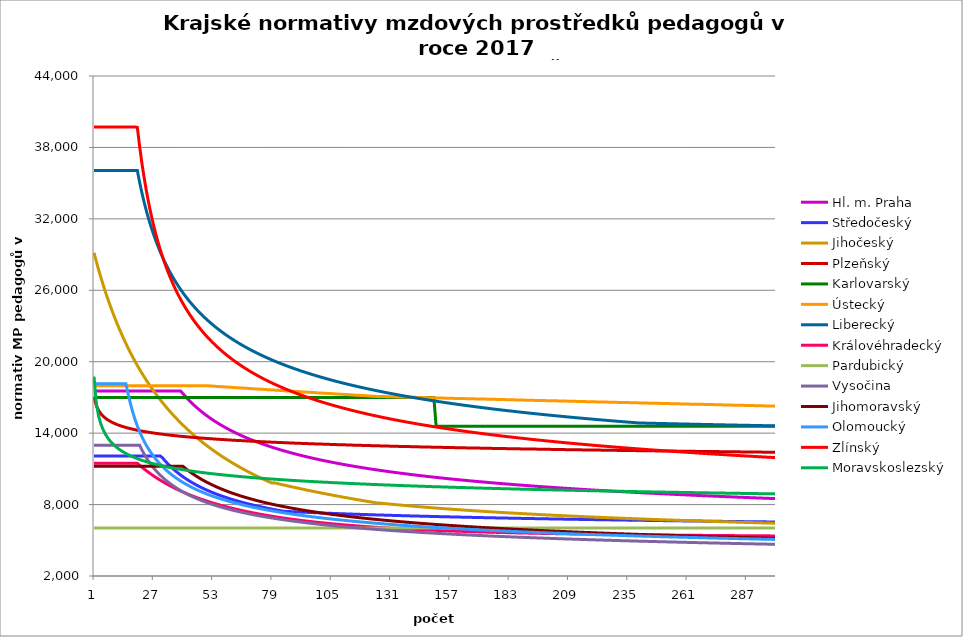
| Category | Hl. m. Praha | Středočeský | Jihočeský | Plzeňský | Karlovarský  | Ústecký   | Liberecký | Královéhradecký | Pardubický | Vysočina | Jihomoravský | Olomoucký | Zlínský | Moravskoslezský |
|---|---|---|---|---|---|---|---|---|---|---|---|---|---|---|
| 0 | 17540.399 | 12085.225 | 29144.953 | 17065.183 | 17000 | 17988.82 | 36063.29 | 11471.338 | 6030.48 | 12987.917 | 11210.627 | 18145.624 | 39713.089 | 18748.669 |
| 1 | 17540.399 | 12085.225 | 28426.203 | 16321.338 | 17000 | 17988.82 | 36063.29 | 11471.338 | 6030.48 | 12987.917 | 11210.627 | 18145.624 | 39713.089 | 16521.105 |
| 2 | 17540.399 | 12085.225 | 27742.05 | 15910.079 | 17000 | 17988.82 | 36063.29 | 11471.338 | 6030.48 | 12987.917 | 11210.627 | 18145.624 | 39713.089 | 15450.292 |
| 3 | 17540.399 | 12085.225 | 27090.055 | 15632.039 | 17000 | 17988.82 | 36063.29 | 11471.338 | 6030.48 | 12987.917 | 11210.627 | 18145.624 | 39713.089 | 14773.532 |
| 4 | 17540.399 | 12085.225 | 26468.003 | 15422.414 | 17000 | 17988.82 | 36063.29 | 11471.338 | 6030.48 | 12987.917 | 11210.627 | 18145.624 | 39713.089 | 14287.517 |
| 5 | 17540.399 | 12085.225 | 25873.877 | 15261.611 | 17000 | 17988.82 | 36063.29 | 11471.338 | 6030.48 | 12987.917 | 11210.627 | 18145.624 | 39713.089 | 13911.365 |
| 6 | 17540.399 | 12085.225 | 25305.838 | 15118.31 | 17000 | 17988.82 | 36063.29 | 11471.338 | 6030.48 | 12987.917 | 11210.627 | 18145.624 | 39713.089 | 13606.867 |
| 7 | 17540.399 | 12085.225 | 24762.205 | 15005.592 | 17000 | 17988.82 | 36063.29 | 11471.338 | 6030.48 | 12987.917 | 11210.627 | 18145.624 | 39713.089 | 13354.676 |
| 8 | 17540.399 | 12085.225 | 24241.438 | 14901.435 | 17000 | 17988.82 | 36063.29 | 11471.338 | 6030.48 | 12987.917 | 11210.627 | 18145.624 | 39713.089 | 13144.279 |
| 9 | 17540.399 | 12085.225 | 23742.124 | 14812.328 | 17000 | 17988.82 | 36063.29 | 11471.338 | 6030.48 | 12987.917 | 11210.627 | 18145.624 | 39713.089 | 12956.273 |
| 10 | 17540.399 | 12085.225 | 23262.964 | 14731.016 | 17000 | 17988.82 | 36063.29 | 11471.338 | 6030.48 | 12987.917 | 11210.627 | 18145.624 | 39713.089 | 12794.189 |
| 11 | 17540.399 | 12085.225 | 22802.763 | 14657.26 | 17000 | 17988.82 | 36063.29 | 11471.338 | 6030.48 | 12987.917 | 11210.627 | 18145.624 | 39713.089 | 12646.191 |
| 12 | 17540.399 | 12085.225 | 22360.416 | 14590.847 | 17000 | 17988.82 | 36063.29 | 11471.338 | 6030.48 | 12987.917 | 11210.627 | 18145.624 | 39713.089 | 12516.384 |
| 13 | 17540.399 | 12085.225 | 21934.904 | 14531.588 | 17000 | 17988.82 | 36063.29 | 11471.338 | 6030.48 | 12987.917 | 11210.627 | 18145.624 | 39713.089 | 12398.905 |
| 14 | 17540.399 | 12085.225 | 21525.285 | 14472.809 | 17000 | 17988.82 | 36063.29 | 11471.338 | 6030.48 | 12987.917 | 11210.627 | 18145.624 | 39713.089 | 12288.372 |
| 15 | 17540.399 | 12085.225 | 21130.684 | 14420.958 | 17000 | 17988.82 | 36063.29 | 11471.338 | 6030.48 | 12987.917 | 11210.627 | 17278.667 | 39713.089 | 12189.158 |
| 16 | 17540.399 | 12085.225 | 20750.29 | 14375.893 | 17000 | 17988.82 | 36063.29 | 11471.338 | 6030.48 | 12987.917 | 11210.627 | 16455.873 | 39713.089 | 12096.147 |
| 17 | 17540.399 | 12085.225 | 20383.35 | 14331.108 | 17000 | 17988.82 | 36063.29 | 11471.338 | 6030.48 | 12987.917 | 11210.627 | 15755.623 | 39713.089 | 12009.091 |
| 18 | 17540.399 | 12085.225 | 20029.161 | 14286.602 | 17000 | 17988.82 | 36063.29 | 11471.338 | 6030.48 | 12987.917 | 11210.627 | 15141.967 | 39713.089 | 11927.765 |
| 19 | 17540.399 | 12085.225 | 19687.072 | 14242.371 | 17000 | 17988.82 | 36063.29 | 11471.338 | 6030.48 | 12987.917 | 11210.627 | 14601.69 | 39681.862 | 11856.395 |
| 20 | 17540.399 | 12085.225 | 19356.472 | 14204.676 | 17000 | 17988.82 | 35079.368 | 11302.828 | 6030.48 | 12987.917 | 11210.627 | 14124.251 | 38087.978 | 11785.874 |
| 21 | 17540.399 | 12085.225 | 19036.792 | 14173.415 | 17000 | 17988.82 | 34189.959 | 11143.23 | 6030.48 | 12594.328 | 11210.627 | 13695.112 | 36683.101 | 11716.186 |
| 22 | 17540.399 | 12085.225 | 18727.499 | 14136.084 | 17000 | 17988.82 | 33381.233 | 10988.076 | 6030.48 | 12240.408 | 11210.627 | 13308.344 | 35434.217 | 11655.882 |
| 23 | 17540.399 | 12085.225 | 18428.096 | 14105.125 | 17000 | 17988.82 | 32641.988 | 10837.183 | 6030.48 | 11919.26 | 11210.627 | 12959 | 34315.662 | 11596.196 |
| 24 | 17540.399 | 12085.225 | 18138.116 | 14074.301 | 17000 | 17988.82 | 31963.05 | 10694.093 | 6030.48 | 11626.884 | 11210.627 | 12642.927 | 33307.178 | 11537.118 |
| 25 | 17540.399 | 12085.225 | 17857.121 | 14043.611 | 17000 | 17988.82 | 31336.825 | 10558.353 | 6030.48 | 11359.077 | 11210.627 | 12351.708 | 32392.554 | 11482.796 |
| 26 | 17540.399 | 12085.225 | 17584.699 | 14013.055 | 17000 | 17988.82 | 30756.975 | 10422.486 | 6030.48 | 11112.669 | 11210.627 | 12082.984 | 31558.654 | 11433.105 |
| 27 | 17540.399 | 12085.225 | 17320.464 | 13988.705 | 17000 | 17988.82 | 30218.162 | 10296.956 | 6030.48 | 10885.311 | 11210.627 | 11834.703 | 30794.723 | 11383.842 |
| 28 | 17540.399 | 12085.225 | 17064.052 | 13958.388 | 17000 | 17988.82 | 29715.857 | 10171.051 | 6030.48 | 10674.252 | 11210.627 | 11605.075 | 30091.862 | 11339.056 |
| 29 | 17540.399 | 12085.225 | 16815.122 | 13934.228 | 17000 | 17988.82 | 29246.191 | 10051.47 | 6030.48 | 10478.142 | 11210.627 | 11392.527 | 29442.645 | 11294.621 |
| 30 | 17540.399 | 11937.305 | 16573.35 | 13910.151 | 17000 | 17988.82 | 28805.839 | 9937.875 | 6030.48 | 10295.455 | 11210.627 | 11195.68 | 28840.823 | 11250.532 |
| 31 | 17540.399 | 11711.932 | 16338.432 | 13886.158 | 17000 | 17988.82 | 28391.923 | 9826.82 | 6030.48 | 10124.198 | 11210.627 | 11009.416 | 28281.099 | 11206.787 |
| 32 | 17540.399 | 11501.47 | 16110.08 | 13862.247 | 17000 | 17988.82 | 28001.94 | 9718.219 | 6030.48 | 9963.865 | 11210.627 | 10833.02 | 27758.95 | 11167.312 |
| 33 | 17540.399 | 11304.396 | 15888.024 | 13838.419 | 17000 | 17988.82 | 27633.704 | 9614.995 | 6030.48 | 9812.78 | 11210.627 | 10669.503 | 27270.491 | 11128.115 |
| 34 | 17540.399 | 11119.392 | 15672.006 | 13820.601 | 17000 | 17988.82 | 27285.294 | 9513.941 | 6030.48 | 9670.631 | 11210.627 | 10514.402 | 26812.366 | 11093.072 |
| 35 | 17540.399 | 10945.311 | 15461.783 | 13796.915 | 17000 | 17988.82 | 26955.016 | 9414.989 | 6030.48 | 9536.268 | 11210.627 | 10370.657 | 26381.659 | 11058.249 |
| 36 | 17540.399 | 10781.15 | 15257.125 | 13779.204 | 17000 | 17988.82 | 26641.368 | 9320.896 | 6030.48 | 9409.216 | 11210.627 | 10230.789 | 25975.823 | 11023.644 |
| 37 | 17540.399 | 10626.029 | 15057.815 | 13755.66 | 17000 | 17988.82 | 26343.017 | 9231.434 | 6030.48 | 9288.769 | 11210.627 | 10101.202 | 25592.626 | 10989.255 |
| 38 | 17540.399 | 10479.169 | 14863.644 | 13738.055 | 17000 | 17988.82 | 26058.771 | 9140.956 | 6030.48 | 9174.285 | 11210.627 | 9974.856 | 25230.097 | 10955.079 |
| 39 | 17313.023 | 10339.882 | 14674.418 | 13720.494 | 17000 | 17988.82 | 25787.563 | 9054.898 | 6030.48 | 9065.439 | 11210.627 | 9857.876 | 24886.497 | 10924.879 |
| 40 | 17095.727 | 10207.556 | 14489.949 | 13702.979 | 17000 | 17988.82 | 25528.436 | 8973.061 | 6030.48 | 8961.678 | 11053.999 | 9743.609 | 24560.279 | 10894.845 |
| 41 | 16888.863 | 10081.644 | 14310.06 | 13685.508 | 17000 | 17988.82 | 25280.526 | 8890.121 | 6030.48 | 8862.741 | 10901.688 | 9637.93 | 24250.063 | 10864.976 |
| 42 | 16691.642 | 9961.656 | 14134.583 | 13668.081 | 17000 | 17988.82 | 25043.052 | 8813.746 | 6030.48 | 8768.146 | 10760.83 | 9534.519 | 23954.618 | 10835.27 |
| 43 | 16503.353 | 9847.154 | 13963.357 | 13650.699 | 17000 | 17988.82 | 24815.307 | 8736.191 | 6030.48 | 8677.686 | 10623.565 | 9436.165 | 23672.835 | 10809.41 |
| 44 | 16323.356 | 9737.741 | 13796.23 | 13633.362 | 17000 | 17988.82 | 24596.649 | 8662.426 | 6030.48 | 8591.168 | 10493.236 | 9342.625 | 23403.721 | 10780.007 |
| 45 | 16151.074 | 9633.06 | 13633.057 | 13621.827 | 17000 | 17988.82 | 24386.493 | 8589.897 | 6030.48 | 8507.955 | 10369.463 | 9250.922 | 23146.374 | 10754.41 |
| 46 | 15985.981 | 9532.785 | 13473.698 | 13604.563 | 17000 | 17988.82 | 24184.303 | 8520.93 | 6030.48 | 8428.355 | 10251.895 | 9163.701 | 22899.982 | 10728.934 |
| 47 | 15827.601 | 9436.624 | 13318.022 | 13587.342 | 17000 | 17988.82 | 23989.593 | 8453.062 | 6030.48 | 8351.77 | 10136.963 | 9080.759 | 22663.807 | 10703.579 |
| 48 | 15675.499 | 9344.308 | 13165.902 | 13575.885 | 17000 | 17988.82 | 23801.912 | 8386.267 | 6030.48 | 8278.077 | 10027.757 | 9001.91 | 22437.176 | 10681.941 |
| 49 | 15529.279 | 9255.591 | 13017.218 | 13558.737 | 17000 | 17988.82 | 23620.849 | 8322.769 | 6030.48 | 8206.947 | 9923.989 | 8924.419 | 22219.477 | 10656.807 |
| 50 | 15388.578 | 9170.252 | 12871.855 | 13547.329 | 17000 | 17977.654 | 23446.026 | 8260.225 | 6030.48 | 8138.699 | 9825.396 | 8850.768 | 22010.151 | 10631.791 |
| 51 | 15253.064 | 9088.084 | 12729.702 | 13530.252 | 17000 | 17966.501 | 23277.093 | 8198.615 | 6030.48 | 8072.605 | 9728.743 | 8778.323 | 21808.684 | 10610.442 |
| 52 | 15122.43 | 9008.9 | 12590.655 | 13518.892 | 17000 | 17955.363 | 23113.726 | 8140.069 | 6030.48 | 8008.991 | 9636.906 | 8709.493 | 21614.606 | 10589.178 |
| 53 | 14996.395 | 8932.526 | 12454.612 | 13507.55 | 17000 | 17933.127 | 22955.627 | 8082.353 | 6030.48 | 7947.568 | 9546.787 | 8641.734 | 21427.486 | 10568 |
| 54 | 14874.699 | 8858.802 | 12321.478 | 13490.574 | 17000 | 17922.03 | 22802.518 | 8025.45 | 6030.48 | 7888.06 | 9461.166 | 8577.386 | 21246.923 | 10546.906 |
| 55 | 14757.103 | 8787.582 | 12191.161 | 13479.28 | 17000 | 17910.946 | 22654.143 | 7971.406 | 6030.48 | 7830.403 | 9377.067 | 8513.989 | 21072.552 | 10525.896 |
| 56 | 14643.385 | 8718.728 | 12063.571 | 13468.005 | 17000 | 17899.876 | 22510.263 | 7918.086 | 6030.48 | 7774.727 | 9297.18 | 8453.819 | 20904.03 | 10504.97 |
| 57 | 14533.339 | 8652.115 | 11938.624 | 13456.749 | 17000 | 17888.82 | 22370.653 | 7865.474 | 6030.48 | 7720.776 | 9221.329 | 8394.494 | 20741.045 | 10484.127 |
| 58 | 14426.774 | 8587.625 | 11816.238 | 13445.511 | 17000 | 17877.778 | 22235.108 | 7815.541 | 6030.48 | 7668.497 | 9146.705 | 8338.231 | 20583.304 | 10466.821 |
| 59 | 14323.513 | 8525.149 | 11696.337 | 13428.691 | 17000 | 17866.749 | 22103.433 | 7766.238 | 6030.48 | 7617.652 | 9073.28 | 8282.716 | 20430.536 | 10446.129 |
| 60 | 14223.391 | 8464.587 | 11578.844 | 13417.5 | 17000 | 17855.734 | 21975.447 | 7717.553 | 6030.48 | 7568.38 | 9003.585 | 8230.114 | 20282.489 | 10428.947 |
| 61 | 14126.253 | 8405.843 | 11463.688 | 13406.328 | 17000 | 17833.744 | 21850.98 | 7669.474 | 6030.48 | 7520.634 | 8937.475 | 8178.175 | 20138.928 | 10408.404 |
| 62 | 14031.956 | 8348.83 | 11350.801 | 13395.175 | 17000 | 17822.769 | 21729.873 | 7623.879 | 6030.48 | 7474.014 | 8869.843 | 8126.888 | 19999.634 | 10391.347 |
| 63 | 13940.365 | 8293.464 | 11240.115 | 13384.04 | 17000 | 17811.808 | 21611.977 | 7578.823 | 6030.48 | 7428.839 | 8808.127 | 8078.338 | 19864.403 | 10374.346 |
| 64 | 13851.355 | 8239.67 | 11131.566 | 13378.479 | 17000 | 17800.86 | 21497.152 | 7536.141 | 6030.48 | 7384.895 | 8744.847 | 8030.364 | 19733.043 | 10357.4 |
| 65 | 13764.808 | 8187.374 | 11025.095 | 13367.372 | 17000 | 17789.926 | 21385.267 | 7493.937 | 6030.48 | 7342.147 | 8684.852 | 7982.957 | 19605.375 | 10340.509 |
| 66 | 13680.613 | 8136.51 | 10920.64 | 13356.284 | 17000 | 17779.006 | 21276.196 | 7452.203 | 6030.48 | 7300.396 | 8625.675 | 7938.132 | 19481.232 | 10323.673 |
| 67 | 13598.666 | 8087.014 | 10818.147 | 13345.213 | 17000 | 17768.098 | 21169.824 | 7410.932 | 6030.48 | 7259.782 | 8569.618 | 7893.807 | 19360.456 | 10306.892 |
| 68 | 13518.871 | 8038.826 | 10717.559 | 13334.161 | 17000 | 17746.324 | 21066.041 | 7371.88 | 6030.48 | 7220.274 | 8514.286 | 7851.957 | 19242.899 | 10290.166 |
| 69 | 13441.135 | 7991.89 | 10618.825 | 13323.128 | 17000 | 17735.456 | 20964.742 | 7331.491 | 6030.48 | 7181.682 | 8461.925 | 7808.586 | 19128.423 | 10273.493 |
| 70 | 13365.371 | 7946.153 | 10521.893 | 13317.618 | 17000 | 17724.602 | 20865.828 | 7294.999 | 6030.48 | 7143.984 | 8407.97 | 7767.632 | 19016.896 | 10260.194 |
| 71 | 13291.499 | 7901.566 | 10426.715 | 13306.612 | 17000 | 17713.761 | 20769.208 | 7257.156 | 6030.48 | 7107.316 | 8356.905 | 7729.026 | 18908.194 | 10243.619 |
| 72 | 13219.442 | 7858.081 | 10333.243 | 13295.623 | 17000 | 17702.934 | 20674.793 | 7221.398 | 6030.48 | 7071.495 | 8308.637 | 7688.9 | 18802.202 | 10230.397 |
| 73 | 13149.126 | 7815.654 | 10241.433 | 13284.653 | 17000 | 17692.12 | 20582.5 | 7185.991 | 6030.48 | 7036.503 | 8258.768 | 7651.07 | 18698.81 | 10213.918 |
| 74 | 13080.483 | 7774.243 | 10151.239 | 13279.175 | 17000 | 17681.319 | 20492.249 | 7150.929 | 6030.48 | 7002.319 | 8211.624 | 7613.611 | 18597.915 | 10200.772 |
| 75 | 13013.448 | 7733.808 | 10062.62 | 13268.232 | 17000 | 17670.531 | 20403.967 | 7117.854 | 6030.48 | 6968.924 | 8167.123 | 7578.363 | 18499.417 | 10184.388 |
| 76 | 12947.96 | 7694.313 | 9975.535 | 13257.308 | 17000 | 17648.995 | 20317.581 | 7083.452 | 6030.48 | 6936.151 | 8121.016 | 7541.61 | 18403.225 | 10171.319 |
| 77 | 12883.96 | 7655.72 | 9889.945 | 13251.852 | 17000 | 17638.246 | 20233.024 | 7052.612 | 6030.48 | 6904.285 | 8077.489 | 7507.024 | 18309.249 | 10158.283 |
| 78 | 12821.394 | 7617.997 | 9805.81 | 13240.954 | 17000 | 17627.511 | 20150.232 | 7020.438 | 6030.48 | 6873.009 | 8034.425 | 7472.753 | 18217.408 | 10145.28 |
| 79 | 12760.207 | 7581.112 | 9829.122 | 13235.512 | 17000 | 17616.788 | 20069.143 | 6988.556 | 6030.48 | 6842.457 | 7993.837 | 7440.574 | 18127.622 | 10132.311 |
| 80 | 12700.351 | 7545.034 | 9783.93 | 13224.641 | 17000 | 17606.079 | 19989.7 | 6958.535 | 6030.48 | 6812.469 | 7951.658 | 7406.906 | 18039.815 | 10119.374 |
| 81 | 12641.778 | 7509.734 | 9739.151 | 13219.212 | 17000 | 17595.383 | 19911.847 | 6928.771 | 6030.48 | 6783.178 | 7911.9 | 7375.29 | 17953.917 | 10106.471 |
| 82 | 12584.444 | 7475.184 | 9694.78 | 13208.368 | 17000 | 17584.699 | 19835.531 | 6900.807 | 6030.48 | 6754.425 | 7872.537 | 7343.943 | 17869.86 | 10093.601 |
| 83 | 12528.304 | 7441.36 | 9650.812 | 13202.952 | 17000 | 17563.372 | 19760.7 | 6871.534 | 6030.48 | 6726.343 | 7835.504 | 7314.581 | 17787.578 | 10080.763 |
| 84 | 12473.319 | 7427.931 | 9607.241 | 13192.134 | 17000 | 17552.727 | 19687.308 | 6844.029 | 6030.48 | 6698.777 | 7796.896 | 7283.747 | 17707.012 | 10067.958 |
| 85 | 12419.449 | 7418.56 | 9564.061 | 13186.732 | 17000 | 17542.096 | 19615.309 | 6816.744 | 6030.48 | 6671.716 | 7760.569 | 7254.864 | 17628.101 | 10055.186 |
| 86 | 12366.657 | 7409.321 | 9521.268 | 13175.941 | 17000 | 17531.477 | 19544.657 | 6789.676 | 6030.48 | 6645.152 | 7724.579 | 7226.208 | 17550.792 | 10042.445 |
| 87 | 12314.908 | 7400.21 | 9478.856 | 13170.552 | 17000 | 17520.871 | 19475.311 | 6764.308 | 6030.48 | 6619.213 | 7688.921 | 7197.778 | 17475.029 | 10029.737 |
| 88 | 12264.167 | 7391.224 | 9436.82 | 13159.787 | 17000 | 17510.278 | 19407.231 | 6739.129 | 6030.48 | 6593.749 | 7655.443 | 7169.571 | 17400.762 | 10020.228 |
| 89 | 12214.403 | 7382.359 | 9395.156 | 13154.412 | 17000 | 17499.698 | 19340.378 | 6714.136 | 6030.48 | 6568.753 | 7622.254 | 7143.225 | 17327.944 | 10007.576 |
| 90 | 12165.584 | 7373.614 | 9353.858 | 13149.04 | 17000 | 17489.13 | 19274.805 | 6689.328 | 6030.48 | 6544.081 | 7587.533 | 7115.443 | 17256.527 | 9994.956 |
| 91 | 12117.682 | 7364.984 | 9312.921 | 13138.311 | 17000 | 17468.034 | 19210.385 | 6664.703 | 6030.48 | 6519.996 | 7556.734 | 7089.492 | 17186.468 | 9985.512 |
| 92 | 12070.667 | 7356.468 | 9272.341 | 13132.953 | 17000 | 17457.505 | 19147.084 | 6641.692 | 6030.48 | 6496.353 | 7524.394 | 7063.729 | 17117.723 | 9972.947 |
| 93 | 12024.512 | 7348.062 | 9232.113 | 13127.599 | 17000 | 17446.988 | 19084.869 | 6618.839 | 6030.48 | 6473.146 | 7492.33 | 7038.153 | 17050.252 | 9963.545 |
| 94 | 11979.192 | 7339.764 | 9192.232 | 13116.904 | 17000 | 17436.484 | 19023.709 | 6596.142 | 6030.48 | 6450.235 | 7462.297 | 7014.344 | 16984.017 | 9951.036 |
| 95 | 11934.681 | 7331.571 | 9152.695 | 13111.564 | 17000 | 17425.993 | 18963.574 | 6573.601 | 6030.48 | 6427.876 | 7432.504 | 6989.124 | 16918.98 | 9941.675 |
| 96 | 11890.956 | 7323.482 | 9113.496 | 13106.227 | 17000 | 17415.514 | 18904.436 | 6552.608 | 6030.48 | 6405.802 | 7402.947 | 6965.644 | 16855.106 | 9929.22 |
| 97 | 11847.994 | 7315.492 | 9074.632 | 13095.567 | 17000 | 17405.048 | 18846.266 | 6530.363 | 6030.48 | 6384.007 | 7373.625 | 6942.321 | 16792.36 | 9919.9 |
| 98 | 11805.773 | 7307.601 | 9036.098 | 13090.244 | 17000 | 17384.154 | 18789.038 | 6509.645 | 6030.48 | 6362.743 | 7344.535 | 6919.155 | 16730.709 | 9910.597 |
| 99 | 11764.272 | 7299.806 | 8997.889 | 13084.925 | 17000 | 17373.725 | 18732.726 | 6489.058 | 6030.48 | 6341.746 | 7317.364 | 6896.142 | 16670.123 | 9898.22 |
| 100 | 11723.47 | 7292.105 | 8960.003 | 13079.61 | 17000 | 17363.309 | 18677.307 | 6469.96 | 6030.48 | 6321.14 | 7290.394 | 6873.282 | 16610.569 | 9888.958 |
| 101 | 11683.347 | 7284.496 | 8922.434 | 13068.994 | 17000 | 17352.906 | 18622.755 | 6449.623 | 6030.48 | 6300.918 | 7261.955 | 6852.082 | 16552.021 | 9879.713 |
| 102 | 11643.886 | 7276.977 | 8885.178 | 13063.692 | 17000 | 17342.515 | 18569.049 | 6430.756 | 6030.48 | 6280.949 | 7235.391 | 6829.513 | 16494.448 | 9870.486 |
| 103 | 11605.068 | 7269.545 | 8848.233 | 13058.394 | 17000 | 17332.136 | 18516.166 | 6412 | 6030.48 | 6261.23 | 7210.663 | 6808.581 | 16437.826 | 9861.275 |
| 104 | 11566.876 | 7262.2 | 8811.594 | 13053.101 | 17000 | 17321.77 | 18464.085 | 6393.353 | 6030.48 | 6241.88 | 7184.472 | 6787.778 | 16382.127 | 9849.021 |
| 105 | 11529.293 | 7254.939 | 8775.256 | 13047.812 | 17000 | 17311.417 | 18412.787 | 6374.814 | 6030.48 | 6222.894 | 7158.471 | 6767.102 | 16327.327 | 9839.851 |
| 106 | 11492.303 | 7247.76 | 8739.218 | 13037.247 | 17000 | 17290.746 | 18362.249 | 6357.695 | 6030.48 | 6204.144 | 7134.265 | 6746.551 | 16273.402 | 9830.698 |
| 107 | 11455.89 | 7240.662 | 8703.474 | 13031.971 | 17000 | 17280.43 | 18312.455 | 6340.667 | 6030.48 | 6185.627 | 7110.222 | 6726.125 | 16220.328 | 9821.561 |
| 108 | 11420.039 | 7233.644 | 8668.021 | 13026.699 | 17000 | 17270.125 | 18263.386 | 6322.432 | 6030.48 | 6167.461 | 7086.341 | 6705.821 | 16168.084 | 9812.442 |
| 109 | 11384.737 | 7226.702 | 8632.856 | 13021.431 | 17000 | 17259.833 | 18215.023 | 6306.885 | 6030.48 | 6149.639 | 7062.62 | 6687.078 | 16116.649 | 9803.34 |
| 110 | 11349.969 | 7219.837 | 8597.975 | 13016.168 | 17000 | 17249.553 | 18167.35 | 6290.129 | 6030.48 | 6131.92 | 7039.057 | 6668.439 | 16066 | 9794.254 |
| 111 | 11315.721 | 7213.046 | 8563.375 | 13010.909 | 17000 | 17239.286 | 18120.35 | 6273.461 | 6030.48 | 6114.539 | 7015.651 | 6648.482 | 16016.119 | 9785.185 |
| 112 | 11281.982 | 7206.328 | 8529.052 | 13005.654 | 17000 | 17229.03 | 18074.007 | 6258.154 | 6030.48 | 6097.373 | 6992.399 | 6630.058 | 15966.985 | 9776.133 |
| 113 | 11248.737 | 7199.682 | 8495.003 | 12995.157 | 17000 | 17208.556 | 18028.306 | 6242.921 | 6030.48 | 6080.537 | 6970.837 | 6611.735 | 15918.582 | 9767.098 |
| 114 | 11215.976 | 7193.106 | 8461.225 | 12989.915 | 17000 | 17198.337 | 17983.232 | 6226.502 | 6030.48 | 6063.909 | 6949.407 | 6593.513 | 15870.89 | 9761.084 |
| 115 | 11183.686 | 7186.598 | 8427.714 | 12984.677 | 17000 | 17188.131 | 17938.77 | 6212.677 | 6030.48 | 6047.487 | 6926.592 | 6575.391 | 15823.892 | 9752.076 |
| 116 | 11151.856 | 7180.158 | 8394.468 | 12979.444 | 17000 | 17177.936 | 17894.905 | 6197.664 | 6030.48 | 6031.269 | 6905.433 | 6558.752 | 15777.571 | 9743.085 |
| 117 | 11120.476 | 7173.785 | 8361.484 | 12974.214 | 17000 | 17167.753 | 17851.626 | 6182.724 | 6030.48 | 6015.366 | 6884.403 | 6540.82 | 15731.911 | 9734.111 |
| 118 | 11089.534 | 7167.476 | 8328.757 | 12968.989 | 17000 | 17157.583 | 17808.918 | 6169.092 | 6030.48 | 5999.546 | 6864.989 | 6524.355 | 15686.897 | 9725.153 |
| 119 | 11059.021 | 7161.231 | 8296.286 | 12963.768 | 17000 | 17147.425 | 17766.768 | 6155.52 | 6030.48 | 5984.035 | 6844.204 | 6506.611 | 15642.514 | 9719.191 |
| 120 | 11028.926 | 7155.048 | 8264.066 | 12958.551 | 17000 | 17137.278 | 17725.165 | 6142.008 | 6030.48 | 5968.716 | 6823.545 | 6490.317 | 15598.746 | 9710.26 |
| 121 | 10999.24 | 7148.927 | 8232.096 | 12953.339 | 17000 | 17117.021 | 17684.097 | 6128.554 | 6030.48 | 5953.588 | 6804.472 | 6474.105 | 15555.579 | 9701.346 |
| 122 | 10969.954 | 7142.866 | 8200.373 | 12948.13 | 17000 | 17106.911 | 17643.551 | 6115.16 | 6030.48 | 5938.647 | 6784.051 | 6457.973 | 15513.001 | 9692.449 |
| 123 | 10941.059 | 7136.865 | 8168.893 | 12942.926 | 17000 | 17096.812 | 17603.517 | 6101.824 | 6030.48 | 5923.892 | 6765.199 | 6441.922 | 15470.996 | 9686.526 |
| 124 | 10912.546 | 7130.921 | 8137.654 | 12937.726 | 17000 | 17086.726 | 17563.983 | 6089.751 | 6030.48 | 5909.43 | 6746.451 | 6425.95 | 15429.554 | 9677.656 |
| 125 | 10884.407 | 7125.035 | 8131.23 | 12932.53 | 17000 | 17086.726 | 17524.94 | 6077.725 | 6030.48 | 5895.038 | 6727.806 | 6410.058 | 15388.66 | 9671.751 |
| 126 | 10856.633 | 7119.205 | 8111.686 | 12927.338 | 17000 | 17076.651 | 17486.376 | 6064.552 | 6030.48 | 5880.935 | 6709.264 | 6394.243 | 15348.303 | 9662.908 |
| 127 | 10829.217 | 7113.43 | 8092.387 | 12922.151 | 17000 | 17076.651 | 17448.282 | 6052.625 | 6030.48 | 5866.899 | 6690.825 | 6379.815 | 15308.471 | 9654.08 |
| 128 | 10802.151 | 7107.709 | 8073.329 | 12916.968 | 17000 | 17066.588 | 17410.648 | 6040.746 | 6030.48 | 5853.037 | 6672.486 | 6364.15 | 15269.153 | 9648.205 |
| 129 | 10775.427 | 7102.042 | 8054.507 | 12911.788 | 17000 | 17066.588 | 17373.465 | 6030.094 | 6030.48 | 5839.456 | 6655.647 | 6349.857 | 15230.338 | 9639.404 |
| 130 | 10749.038 | 7096.427 | 8035.916 | 12906.613 | 17000 | 17056.537 | 17336.724 | 6018.303 | 6030.48 | 5825.938 | 6637.5 | 6335.628 | 15192.015 | 9633.546 |
| 131 | 10722.977 | 7090.863 | 8017.55 | 12901.442 | 17000 | 17056.537 | 17300.415 | 6007.73 | 6030.48 | 5812.589 | 6620.837 | 6320.179 | 15154.174 | 9624.772 |
| 132 | 10697.238 | 7085.35 | 7999.406 | 12896.276 | 17000 | 17046.498 | 17264.531 | 5996.026 | 6030.48 | 5799.514 | 6602.879 | 6306.083 | 15116.804 | 9618.932 |
| 133 | 10671.813 | 7079.886 | 7981.479 | 12891.113 | 17000 | 17046.498 | 17229.062 | 5985.531 | 6030.48 | 5786.496 | 6586.389 | 6292.049 | 15079.895 | 9610.185 |
| 134 | 10646.697 | 7074.472 | 7963.765 | 12885.954 | 17000 | 17036.471 | 17194 | 5975.073 | 6030.48 | 5773.643 | 6569.981 | 6278.078 | 15043.439 | 9604.362 |
| 135 | 10621.883 | 7069.106 | 7946.259 | 12880.8 | 17000 | 17036.471 | 17159.338 | 5964.651 | 6030.48 | 5760.951 | 6553.655 | 6264.169 | 15007.426 | 9595.642 |
| 136 | 10597.364 | 7063.787 | 7928.957 | 12880.8 | 17000 | 17026.455 | 17125.069 | 5954.266 | 6030.48 | 5748.418 | 6537.41 | 6250.322 | 14971.847 | 9589.837 |
| 137 | 10573.136 | 7058.515 | 7911.855 | 12875.65 | 17000 | 17026.455 | 17091.183 | 5945.065 | 6030.48 | 5736.044 | 6521.245 | 6237.786 | 14936.693 | 9584.039 |
| 138 | 10549.192 | 7053.288 | 7894.95 | 12870.504 | 17000 | 17016.451 | 17057.675 | 5934.747 | 6030.48 | 5723.723 | 6505.159 | 6224.054 | 14901.956 | 9575.355 |
| 139 | 10525.526 | 7048.107 | 7878.237 | 12865.362 | 17000 | 17016.451 | 17024.536 | 5925.606 | 6030.48 | 5711.661 | 6489.153 | 6210.383 | 14867.627 | 9569.574 |
| 140 | 10502.134 | 7042.97 | 7861.713 | 12860.224 | 17000 | 17006.459 | 16991.76 | 5916.494 | 6030.48 | 5699.65 | 6474.55 | 6198.007 | 14833.699 | 9563.801 |
| 141 | 10479.01 | 7037.877 | 7845.374 | 12855.09 | 17000 | 17006.459 | 16959.341 | 5906.275 | 6030.48 | 5687.79 | 6458.694 | 6184.45 | 14800.164 | 9555.154 |
| 142 | 10456.148 | 7032.827 | 7829.216 | 12849.96 | 17000 | 16996.479 | 16927.272 | 5897.222 | 6030.48 | 5676.082 | 6442.915 | 6172.177 | 14767.013 | 9549.398 |
| 143 | 10433.545 | 7027.819 | 7813.238 | 12844.834 | 17000 | 16996.479 | 16895.545 | 5888.196 | 6030.48 | 5664.523 | 6428.519 | 6159.952 | 14734.24 | 9543.648 |
| 144 | 10411.194 | 7022.853 | 7797.434 | 12839.713 | 17000 | 16986.51 | 16864.156 | 5880.321 | 6030.48 | 5653.011 | 6414.187 | 6146.561 | 14701.838 | 9535.038 |
| 145 | 10389.092 | 7017.928 | 7781.802 | 12839.713 | 17000 | 16986.51 | 16833.098 | 5871.347 | 6030.48 | 5641.746 | 6398.625 | 6134.438 | 14669.799 | 9529.306 |
| 146 | 10367.233 | 7013.043 | 7766.338 | 12834.595 | 17000 | 16976.553 | 16802.364 | 5862.4 | 6030.48 | 5630.527 | 6384.426 | 6122.362 | 14638.116 | 9523.581 |
| 147 | 10345.613 | 7008.198 | 7751.04 | 12829.482 | 17000 | 16976.553 | 16771.95 | 5854.594 | 6030.48 | 5619.451 | 6370.29 | 6110.334 | 14606.784 | 9517.863 |
| 148 | 10324.228 | 7003.393 | 7735.905 | 12824.373 | 17000 | 16966.608 | 16741.85 | 5845.698 | 6030.48 | 5608.419 | 6356.216 | 6098.353 | 14575.795 | 9509.298 |
| 149 | 10303.073 | 6998.626 | 7720.929 | 12819.268 | 17000 | 16966.608 | 16712.057 | 5837.936 | 6030.48 | 5597.627 | 6342.204 | 6086.419 | 14545.143 | 9503.597 |
| 150 | 10282.144 | 6993.897 | 7706.11 | 12814.166 | 14571.429 | 16956.674 | 16682.568 | 5830.195 | 6030.48 | 5586.878 | 6328.254 | 6074.531 | 14514.823 | 9497.903 |
| 151 | 10261.438 | 6989.206 | 7691.445 | 12814.166 | 14571.429 | 16956.674 | 16653.376 | 5822.474 | 6030.48 | 5576.169 | 6314.366 | 6063.872 | 14484.827 | 9492.216 |
| 152 | 10240.95 | 6984.552 | 7676.932 | 12809.069 | 14571.429 | 16946.752 | 16624.476 | 5814.774 | 6030.48 | 5565.697 | 6301.792 | 6052.072 | 14455.151 | 9486.535 |
| 153 | 10220.676 | 6979.934 | 7662.567 | 12803.976 | 14571.429 | 16946.752 | 16595.864 | 5807.094 | 6030.48 | 5555.264 | 6288.019 | 6040.319 | 14425.788 | 9480.861 |
| 154 | 10200.612 | 6975.352 | 7648.348 | 12798.887 | 14571.429 | 16936.842 | 16567.534 | 5799.435 | 6030.48 | 5544.967 | 6274.306 | 6029.779 | 14396.733 | 9475.194 |
| 155 | 10180.756 | 6970.806 | 7634.273 | 12793.802 | 14571.429 | 16936.842 | 16539.482 | 5792.885 | 6030.48 | 5534.804 | 6261.892 | 6018.111 | 14367.98 | 9466.706 |
| 156 | 10161.103 | 6966.294 | 7620.339 | 12793.802 | 14571.429 | 16926.943 | 16511.704 | 5785.263 | 6030.48 | 5524.679 | 6248.292 | 6007.649 | 14339.525 | 9461.056 |
| 157 | 10141.649 | 6961.817 | 7606.544 | 12788.721 | 14571.429 | 16926.943 | 16484.194 | 5778.746 | 6030.48 | 5514.687 | 6235.98 | 5996.067 | 14311.362 | 9455.413 |
| 158 | 10122.393 | 6957.374 | 7592.885 | 12783.644 | 14571.429 | 16917.056 | 16456.948 | 5772.243 | 6030.48 | 5504.73 | 6223.717 | 5985.681 | 14283.486 | 9449.776 |
| 159 | 10103.329 | 6952.964 | 7579.36 | 12778.571 | 14571.429 | 16917.056 | 16429.962 | 5764.675 | 6030.48 | 5495.001 | 6210.283 | 5975.331 | 14255.892 | 9444.147 |
| 160 | 10084.454 | 6948.588 | 7565.968 | 12773.503 | 14571.429 | 16917.056 | 16403.232 | 5758.204 | 6030.48 | 5485.21 | 6198.12 | 5965.017 | 14228.575 | 9438.523 |
| 161 | 10065.767 | 6944.243 | 7552.705 | 12773.503 | 14571.429 | 16907.18 | 16376.753 | 5751.747 | 6030.48 | 5475.644 | 6186.005 | 5953.599 | 14201.531 | 9432.907 |
| 162 | 10047.263 | 6939.932 | 7539.569 | 12768.438 | 14571.429 | 16907.18 | 16350.522 | 5745.305 | 6030.48 | 5466.11 | 6173.937 | 5943.359 | 14174.755 | 9427.297 |
| 163 | 10028.939 | 6935.651 | 7526.559 | 12763.377 | 14571.429 | 16897.316 | 16324.534 | 5738.877 | 6030.48 | 5456.704 | 6161.916 | 5933.155 | 14148.243 | 9421.694 |
| 164 | 10010.793 | 6931.402 | 7513.673 | 12758.32 | 14571.429 | 16897.316 | 16298.786 | 5732.464 | 6030.48 | 5447.33 | 6149.942 | 5922.986 | 14121.99 | 9416.097 |
| 165 | 9992.822 | 6927.184 | 7500.908 | 12758.32 | 14571.429 | 16887.464 | 16273.274 | 5727.131 | 6030.48 | 5438.082 | 6138.014 | 5912.852 | 14095.992 | 9410.508 |
| 166 | 9975.022 | 6922.996 | 7488.263 | 12753.267 | 14571.429 | 16887.464 | 16247.994 | 5720.743 | 6030.48 | 5428.865 | 6126.132 | 5902.752 | 14070.245 | 9404.924 |
| 167 | 9957.391 | 6918.838 | 7475.735 | 12748.219 | 14571.429 | 16877.622 | 16222.943 | 5714.371 | 6030.48 | 5419.864 | 6114.297 | 5893.803 | 14044.745 | 9399.348 |
| 168 | 9939.927 | 6914.71 | 7463.323 | 12743.174 | 14571.429 | 16877.622 | 16198.117 | 5709.071 | 6030.48 | 5410.801 | 6103.684 | 5883.768 | 14019.487 | 9393.778 |
| 169 | 9922.626 | 6910.611 | 7451.026 | 12743.174 | 14571.429 | 16867.793 | 16173.513 | 5703.781 | 6030.48 | 5401.952 | 6091.935 | 5873.768 | 13994.468 | 9388.214 |
| 170 | 9905.486 | 6906.541 | 7438.84 | 12738.133 | 14571.429 | 16867.793 | 16149.127 | 5697.445 | 6030.48 | 5393.041 | 6080.231 | 5863.801 | 13969.685 | 9382.658 |
| 171 | 9888.505 | 6902.5 | 7426.765 | 12733.096 | 14571.429 | 16857.974 | 16124.956 | 5692.177 | 6030.48 | 5384.341 | 6069.735 | 5854.97 | 13945.133 | 9377.107 |
| 172 | 9871.68 | 6898.486 | 7414.799 | 12728.063 | 14571.429 | 16857.974 | 16100.997 | 5686.918 | 6030.48 | 5375.67 | 6058.116 | 5845.067 | 13920.808 | 9371.564 |
| 173 | 9855.009 | 6894.5 | 7402.94 | 12728.063 | 14571.429 | 16848.168 | 16077.246 | 5681.669 | 6030.48 | 5367.026 | 6047.697 | 5836.292 | 13896.708 | 9368.794 |
| 174 | 9838.488 | 6890.542 | 7391.186 | 12723.034 | 14571.429 | 16848.168 | 16053.701 | 5676.429 | 6030.48 | 5358.501 | 6036.163 | 5826.452 | 13872.828 | 9363.26 |
| 175 | 9822.117 | 6886.611 | 7379.537 | 12718.009 | 14571.429 | 16838.372 | 16030.358 | 5671.2 | 6030.48 | 5350.093 | 6025.819 | 5817.733 | 13849.166 | 9357.733 |
| 176 | 9805.893 | 6882.706 | 7367.989 | 12718.009 | 14571.429 | 16838.372 | 16007.215 | 5665.979 | 6030.48 | 5341.711 | 6015.51 | 5807.955 | 13825.718 | 9352.212 |
| 177 | 9789.813 | 6878.828 | 7356.543 | 12712.989 | 14571.429 | 16828.588 | 15984.268 | 5660.769 | 6030.48 | 5333.445 | 6004.098 | 5799.291 | 13802.48 | 9346.698 |
| 178 | 9773.875 | 6874.976 | 7345.196 | 12707.972 | 14571.429 | 16828.588 | 15961.515 | 5656.607 | 6030.48 | 5325.205 | 5993.864 | 5790.654 | 13779.45 | 9341.19 |
| 179 | 9758.077 | 6871.15 | 7333.946 | 12707.972 | 14571.429 | 16818.815 | 15938.953 | 5651.414 | 6030.48 | 5316.991 | 5983.664 | 5782.041 | 13756.624 | 9335.689 |
| 180 | 9742.418 | 6867.349 | 7322.793 | 12702.959 | 14571.429 | 16818.815 | 15916.579 | 5646.23 | 6030.48 | 5308.979 | 5973.499 | 5772.383 | 13734 | 9332.941 |
| 181 | 9726.894 | 6863.573 | 7311.736 | 12697.95 | 14571.429 | 16809.054 | 15894.39 | 5642.09 | 6030.48 | 5300.903 | 5963.369 | 5763.825 | 13711.574 | 9327.449 |
| 182 | 9711.505 | 6859.822 | 7300.772 | 12692.944 | 14571.429 | 16809.054 | 15872.384 | 5636.923 | 6030.48 | 5292.939 | 5953.273 | 5755.292 | 13689.343 | 9321.964 |
| 183 | 9696.247 | 6856.095 | 7289.9 | 12692.944 | 14571.429 | 16799.304 | 15850.559 | 5632.796 | 6030.48 | 5285.088 | 5943.211 | 5746.785 | 13667.305 | 9316.485 |
| 184 | 9681.12 | 6852.393 | 7279.119 | 12687.943 | 14571.429 | 16799.304 | 15828.911 | 5628.676 | 6030.48 | 5277.26 | 5933.183 | 5738.303 | 13645.456 | 9311.013 |
| 185 | 9666.121 | 6848.715 | 7268.428 | 12682.946 | 14571.429 | 16789.565 | 15807.439 | 5623.534 | 6030.48 | 5269.543 | 5923.189 | 5729.845 | 13623.795 | 9308.28 |
| 186 | 9651.249 | 6845.06 | 7257.825 | 12682.946 | 14571.429 | 16789.565 | 15786.139 | 5619.427 | 6030.48 | 5261.848 | 5914.334 | 5721.413 | 13602.318 | 9302.817 |
| 187 | 9636.501 | 6841.428 | 7247.31 | 12677.953 | 14571.429 | 16779.838 | 15765.01 | 5615.326 | 6030.48 | 5254.263 | 5904.403 | 5713.005 | 13581.022 | 9297.361 |
| 188 | 9621.876 | 6837.82 | 7236.88 | 12672.963 | 14571.429 | 16779.838 | 15744.049 | 5611.231 | 6030.48 | 5246.699 | 5894.505 | 5704.622 | 13559.906 | 9291.911 |
| 189 | 9607.372 | 6834.235 | 7226.535 | 12672.963 | 14571.429 | 16770.122 | 15723.254 | 5607.142 | 6030.48 | 5239.157 | 5885.736 | 5697.307 | 13538.966 | 9289.188 |
| 190 | 9592.988 | 6830.672 | 7216.274 | 12667.978 | 14571.429 | 16770.122 | 15702.623 | 5603.058 | 6030.48 | 5231.724 | 5875.9 | 5688.97 | 13518.199 | 9283.748 |
| 191 | 9578.722 | 6827.131 | 7206.096 | 12662.996 | 14571.429 | 16760.417 | 15682.152 | 5598.981 | 6030.48 | 5224.311 | 5866.098 | 5680.658 | 13497.605 | 9278.314 |
| 192 | 9564.571 | 6823.612 | 7195.998 | 12662.996 | 14571.429 | 16760.417 | 15661.842 | 5594.91 | 6030.48 | 5217.005 | 5857.413 | 5672.369 | 13477.18 | 9275.6 |
| 193 | 9550.535 | 6820.116 | 7185.981 | 12658.019 | 14571.429 | 16750.723 | 15641.688 | 5590.845 | 6030.48 | 5209.72 | 5847.672 | 5665.137 | 13456.921 | 9270.175 |
| 194 | 9536.613 | 6816.64 | 7176.043 | 12658.019 | 14571.429 | 16750.723 | 15621.689 | 5587.8 | 6030.48 | 5202.54 | 5839.041 | 5656.893 | 13436.827 | 9264.757 |
| 195 | 9522.801 | 6813.186 | 7166.183 | 12653.045 | 14571.429 | 16741.04 | 15601.843 | 5583.745 | 6030.48 | 5195.38 | 5830.435 | 5649.7 | 13416.895 | 9262.051 |
| 196 | 9509.1 | 6809.753 | 7156.4 | 12648.075 | 14571.429 | 16741.04 | 15582.148 | 5579.695 | 6030.48 | 5188.324 | 5820.784 | 5641.502 | 13397.123 | 9256.642 |
| 197 | 9495.507 | 6806.341 | 7146.693 | 12648.075 | 14571.429 | 16741.04 | 15562.602 | 5576.662 | 6030.48 | 5181.288 | 5812.231 | 5634.348 | 13377.509 | 9251.24 |
| 198 | 9482.021 | 6802.95 | 7137.061 | 12643.11 | 14571.429 | 16731.369 | 15543.204 | 5572.624 | 6030.48 | 5174.271 | 5803.704 | 5626.194 | 13358.051 | 9248.541 |
| 199 | 9468.64 | 6799.578 | 7127.504 | 12638.148 | 14571.429 | 16731.369 | 15523.95 | 5569.598 | 6030.48 | 5167.357 | 5794.141 | 5619.079 | 13338.746 | 9243.149 |
| 200 | 9455.364 | 6796.227 | 7118.019 | 12638.148 | 14571.429 | 16721.709 | 15504.84 | 5565.57 | 6030.48 | 5160.461 | 5785.667 | 5610.969 | 13319.593 | 9237.762 |
| 201 | 9442.191 | 6792.896 | 7108.606 | 12633.189 | 14571.429 | 16721.709 | 15485.871 | 5562.552 | 6030.48 | 5153.667 | 5777.218 | 5603.892 | 13300.59 | 9235.071 |
| 202 | 9429.118 | 6789.585 | 7099.264 | 12633.189 | 14571.429 | 16712.06 | 15467.042 | 5559.538 | 6030.48 | 5146.892 | 5768.793 | 5596.833 | 13281.734 | 9229.694 |
| 203 | 9416.147 | 6786.293 | 7089.993 | 12628.235 | 14571.429 | 16712.06 | 15448.351 | 5555.523 | 6030.48 | 5140.134 | 5760.393 | 5589.792 | 13263.024 | 9224.324 |
| 204 | 9403.273 | 6783.02 | 7080.791 | 12623.285 | 14571.429 | 16702.422 | 15429.796 | 5552.517 | 6030.48 | 5133.477 | 5752.017 | 5581.766 | 13244.458 | 9221.64 |
| 205 | 9390.498 | 6779.766 | 7071.658 | 12623.285 | 14571.429 | 16702.422 | 15411.375 | 5549.513 | 6030.48 | 5126.837 | 5743.666 | 5574.763 | 13226.033 | 9216.279 |
| 206 | 9377.819 | 6776.531 | 7062.592 | 12618.339 | 14571.429 | 16692.795 | 15393.088 | 5546.513 | 6030.48 | 5120.297 | 5735.339 | 5567.777 | 13207.748 | 9213.601 |
| 207 | 9365.234 | 6773.315 | 7053.592 | 12613.396 | 14571.429 | 16692.795 | 15374.931 | 5542.518 | 6030.48 | 5113.774 | 5727.036 | 5560.808 | 13189.602 | 9208.249 |
| 208 | 9352.744 | 6770.117 | 7044.659 | 12613.396 | 14571.429 | 16683.18 | 15356.904 | 5539.525 | 6030.48 | 5107.267 | 5718.757 | 5553.857 | 13171.592 | 9202.903 |
| 209 | 9340.346 | 6766.938 | 7035.791 | 12608.457 | 14571.429 | 16683.18 | 15339.005 | 5536.535 | 6030.48 | 5100.859 | 5710.502 | 5546.923 | 13153.717 | 9200.232 |
| 210 | 9328.04 | 6763.777 | 7026.987 | 12608.457 | 14571.429 | 16673.575 | 15321.233 | 5533.549 | 6030.48 | 5094.467 | 5703.298 | 5540.007 | 13135.975 | 9195.701 |
| 211 | 9315.824 | 6760.633 | 7018.247 | 12603.523 | 14571.429 | 16673.575 | 15303.585 | 5530.566 | 6030.48 | 5088.173 | 5695.087 | 5533.108 | 13118.365 | 9191.564 |
| 212 | 9303.697 | 6757.507 | 7009.569 | 12603.523 | 14571.429 | 16663.982 | 15286.061 | 5527.586 | 6030.48 | 5081.894 | 5686.9 | 5526.226 | 13100.884 | 9187.45 |
| 213 | 9291.659 | 6754.399 | 7000.953 | 12598.592 | 14571.429 | 16663.982 | 15268.658 | 5525.601 | 6030.48 | 5075.63 | 5678.737 | 5519.361 | 13083.531 | 9183.359 |
| 214 | 9279.707 | 6751.308 | 6992.398 | 12593.664 | 14571.429 | 16654.399 | 15251.376 | 5522.627 | 6030.48 | 5069.382 | 5671.613 | 5512.513 | 13066.304 | 9179.29 |
| 215 | 9267.841 | 6748.234 | 6983.904 | 12593.664 | 14571.429 | 16654.399 | 15234.213 | 5519.656 | 6030.48 | 5063.231 | 5663.493 | 5505.682 | 13049.203 | 9175.244 |
| 216 | 9256.061 | 6745.177 | 6975.469 | 12588.741 | 14571.429 | 16644.828 | 15217.168 | 5516.688 | 6030.48 | 5057.174 | 5656.408 | 5498.868 | 13032.225 | 9171.22 |
| 217 | 9244.364 | 6742.137 | 6967.094 | 12588.741 | 14571.429 | 16644.828 | 15200.239 | 5513.723 | 6030.48 | 5051.052 | 5648.331 | 5492.071 | 13015.368 | 9167.219 |
| 218 | 9232.75 | 6739.114 | 6958.777 | 12583.822 | 14571.429 | 16635.267 | 15183.424 | 5511.748 | 6030.48 | 5045.025 | 5641.283 | 5486.259 | 12998.632 | 9163.239 |
| 219 | 9221.218 | 6736.107 | 6950.517 | 12578.906 | 14571.429 | 16635.267 | 15166.723 | 5508.788 | 6030.48 | 5039.012 | 5633.25 | 5479.493 | 12982.016 | 9159.28 |
| 220 | 9209.767 | 6733.116 | 6942.314 | 12578.906 | 14571.429 | 16625.718 | 15150.135 | 5505.832 | 6030.48 | 5033.094 | 5626.24 | 5472.743 | 12965.516 | 9155.343 |
| 221 | 9198.395 | 6730.142 | 6934.168 | 12573.995 | 14571.429 | 16625.718 | 15133.657 | 5503.863 | 6030.48 | 5027.189 | 5618.25 | 5466.011 | 12949.133 | 9151.428 |
| 222 | 9187.103 | 6727.183 | 6926.077 | 12573.995 | 14571.429 | 16616.179 | 15117.289 | 5500.912 | 6030.48 | 5021.298 | 5611.277 | 5460.253 | 12932.864 | 9147.533 |
| 223 | 9175.888 | 6724.24 | 6918.041 | 12569.087 | 14571.429 | 16616.179 | 15101.029 | 5498.946 | 6030.48 | 5015.5 | 5604.321 | 5453.551 | 12916.709 | 9143.658 |
| 224 | 9164.751 | 6721.313 | 6910.059 | 12569.087 | 14571.429 | 16606.651 | 15084.876 | 5496 | 6030.48 | 5009.716 | 5596.393 | 5447.819 | 12900.666 | 9139.805 |
| 225 | 9153.69 | 6718.402 | 6902.131 | 12564.183 | 14571.429 | 16606.651 | 15068.83 | 5494.038 | 6030.48 | 5003.945 | 5589.474 | 5441.148 | 12884.733 | 9135.971 |
| 226 | 9142.705 | 6715.506 | 6894.256 | 12564.183 | 14571.429 | 16597.135 | 15052.888 | 5491.097 | 6030.48 | 4998.266 | 5582.572 | 5435.442 | 12868.91 | 9132.158 |
| 227 | 9131.793 | 6712.625 | 6886.434 | 12559.282 | 14571.429 | 16597.135 | 15037.049 | 5489.139 | 6030.48 | 4992.6 | 5575.687 | 5428.801 | 12853.195 | 9128.364 |
| 228 | 9120.956 | 6709.759 | 6878.663 | 12554.386 | 14571.429 | 16587.629 | 15021.313 | 5486.203 | 6030.48 | 4986.947 | 5567.84 | 5423.121 | 12837.587 | 9124.591 |
| 229 | 9110.191 | 6706.908 | 6870.943 | 12554.386 | 14571.429 | 16587.629 | 15005.678 | 5484.248 | 6030.48 | 4981.385 | 5560.991 | 5416.51 | 12822.084 | 9120.837 |
| 230 | 9099.498 | 6704.071 | 6863.275 | 12549.493 | 14571.429 | 16578.134 | 14990.144 | 5482.294 | 6030.48 | 4975.835 | 5554.159 | 5410.856 | 12806.686 | 9117.102 |
| 231 | 9088.876 | 6701.25 | 6855.656 | 12549.493 | 14571.429 | 16578.134 | 14974.708 | 5479.366 | 6030.48 | 4970.297 | 5547.344 | 5404.275 | 12791.391 | 9113.386 |
| 232 | 9078.324 | 6698.443 | 6848.087 | 12544.605 | 14571.429 | 16578.134 | 14959.37 | 5477.416 | 6030.48 | 4964.772 | 5540.546 | 5398.646 | 12776.198 | 9109.69 |
| 233 | 9067.842 | 6695.65 | 6840.567 | 12544.605 | 14571.429 | 16568.65 | 14944.13 | 5475.467 | 6030.48 | 4959.337 | 5533.765 | 5393.029 | 12761.106 | 9106.012 |
| 234 | 9057.429 | 6692.872 | 6833.095 | 12539.72 | 14571.429 | 16568.65 | 14928.985 | 5472.546 | 6030.48 | 4953.913 | 5527 | 5386.491 | 12746.114 | 9102.353 |
| 235 | 9047.083 | 6690.107 | 6825.672 | 12539.72 | 14571.429 | 16559.177 | 14913.934 | 5470.601 | 6030.48 | 4948.502 | 5520.251 | 5380.9 | 12731.22 | 9098.712 |
| 236 | 9036.805 | 6687.357 | 6818.295 | 12534.838 | 14571.429 | 16559.177 | 14898.978 | 5468.657 | 6030.48 | 4943.179 | 5513.519 | 5375.32 | 12716.424 | 9095.09 |
| 237 | 9026.594 | 6684.62 | 6810.966 | 12534.838 | 14571.429 | 16549.714 | 14884.114 | 5466.714 | 6030.48 | 4937.868 | 5506.804 | 5369.751 | 12701.724 | 9091.485 |
| 238 | 9016.448 | 6681.897 | 6803.683 | 12529.961 | 14571.429 | 16549.714 | 14869.342 | 5464.773 | 6030.48 | 4932.568 | 5500.104 | 5363.27 | 12687.12 | 9087.899 |
| 239 | 9006.367 | 6679.188 | 6796.446 | 12529.961 | 14571.429 | 16540.263 | 14854.661 | 5461.863 | 6030.48 | 4927.356 | 5493.421 | 5357.726 | 12672.61 | 9084.331 |
| 240 | 8996.35 | 6676.492 | 6789.254 | 12525.088 | 14571.429 | 16540.263 | 14850.033 | 5459.925 | 6030.48 | 4922.155 | 5487.706 | 5352.194 | 12658.193 | 9080.78 |
| 241 | 8986.397 | 6673.809 | 6782.107 | 12525.088 | 14571.429 | 16530.822 | 14845.427 | 5457.989 | 6030.48 | 4916.965 | 5481.053 | 5346.674 | 12643.868 | 9077.246 |
| 242 | 8976.506 | 6671.14 | 6775.005 | 12520.218 | 14571.429 | 16530.822 | 14840.843 | 5456.054 | 6030.48 | 4911.786 | 5474.416 | 5341.164 | 12629.635 | 9073.73 |
| 243 | 8966.678 | 6668.484 | 6767.946 | 12520.218 | 14571.429 | 16521.392 | 14836.28 | 5454.12 | 6030.48 | 4906.694 | 5467.795 | 5335.666 | 12615.492 | 9070.231 |
| 244 | 8956.912 | 6665.84 | 6760.931 | 12515.352 | 14571.429 | 16521.392 | 14831.739 | 5452.188 | 6030.48 | 4901.612 | 5462.133 | 5330.18 | 12601.438 | 9066.749 |
| 245 | 8947.207 | 6663.21 | 6753.959 | 12515.352 | 14571.429 | 16511.973 | 14827.219 | 5450.257 | 6030.48 | 4896.541 | 5455.542 | 5324.705 | 12587.473 | 9063.284 |
| 246 | 8937.561 | 6660.592 | 6747.03 | 12510.49 | 14571.429 | 16511.973 | 14822.72 | 5448.327 | 6030.48 | 4891.556 | 5448.967 | 5319.241 | 12573.595 | 9059.835 |
| 247 | 8927.976 | 6657.987 | 6740.142 | 12510.49 | 14571.429 | 16502.564 | 14818.242 | 5446.399 | 6030.48 | 4886.505 | 5443.344 | 5313.788 | 12559.804 | 9056.403 |
| 248 | 8918.449 | 6655.394 | 6733.296 | 12505.631 | 14571.429 | 16502.564 | 14813.785 | 5444.472 | 6030.48 | 4881.541 | 5436.798 | 5308.346 | 12546.098 | 9052.988 |
| 249 | 8908.981 | 6652.814 | 6726.492 | 12505.631 | 14571.429 | 16493.166 | 14809.348 | 5442.546 | 6030.48 | 4876.661 | 5431.2 | 5302.916 | 12532.476 | 9049.588 |
| 250 | 8899.57 | 6650.246 | 6719.728 | 12500.776 | 14571.429 | 16493.166 | 14804.932 | 5440.622 | 6030.48 | 4871.716 | 5424.683 | 5297.496 | 12518.939 | 9046.205 |
| 251 | 8890.217 | 6647.69 | 6713.005 | 12500.776 | 14571.429 | 16483.779 | 14800.536 | 5439.661 | 6030.48 | 4866.856 | 5419.11 | 5292.088 | 12505.484 | 9042.838 |
| 252 | 8880.92 | 6645.147 | 6706.322 | 12495.925 | 14571.429 | 16483.779 | 14796.16 | 5437.739 | 6030.48 | 4862.006 | 5412.622 | 5286.69 | 12492.111 | 9039.487 |
| 253 | 8871.679 | 6642.615 | 6699.678 | 12495.925 | 14571.429 | 16474.403 | 14791.803 | 5435.818 | 6030.48 | 4857.165 | 5407.073 | 5281.304 | 12478.82 | 9036.151 |
| 254 | 8862.494 | 6640.095 | 6693.074 | 12491.078 | 14571.429 | 16474.403 | 14787.467 | 5433.898 | 6030.48 | 4852.408 | 5400.614 | 5276.824 | 12465.608 | 9032.831 |
| 255 | 8853.363 | 6637.587 | 6686.508 | 12491.078 | 14571.429 | 16465.037 | 14783.149 | 5431.98 | 6030.48 | 4847.66 | 5395.09 | 5271.458 | 12452.477 | 9029.526 |
| 256 | 8844.287 | 6635.09 | 6679.981 | 12486.235 | 14571.429 | 16465.037 | 14778.852 | 5430.064 | 6030.48 | 4842.922 | 5388.66 | 5266.102 | 12439.423 | 9026.236 |
| 257 | 8835.264 | 6632.606 | 6673.491 | 12486.235 | 14571.429 | 16455.682 | 14774.573 | 5428.148 | 6030.48 | 4838.193 | 5383.16 | 5260.758 | 12426.448 | 9022.962 |
| 258 | 8826.295 | 6630.132 | 6667.04 | 12481.395 | 14571.429 | 16455.682 | 14770.313 | 5427.191 | 6030.48 | 4833.547 | 5377.672 | 5256.312 | 12413.55 | 9019.703 |
| 259 | 8817.378 | 6627.67 | 6660.625 | 12481.395 | 14571.429 | 16446.337 | 14766.072 | 5425.278 | 6030.48 | 4828.909 | 5371.283 | 5250.988 | 12400.728 | 9016.459 |
| 260 | 8808.514 | 6625.219 | 6654.248 | 12476.559 | 14571.429 | 16446.337 | 14761.85 | 5423.366 | 6030.48 | 4824.281 | 5365.819 | 5245.674 | 12387.982 | 9013.229 |
| 261 | 8799.701 | 6622.78 | 6647.907 | 12476.559 | 14571.429 | 16437.003 | 14757.647 | 5421.455 | 6030.48 | 4819.662 | 5360.366 | 5240.371 | 12375.31 | 9010.014 |
| 262 | 8790.939 | 6620.351 | 6641.602 | 12471.727 | 14571.429 | 16437.003 | 14753.462 | 5420.5 | 6030.48 | 4815.124 | 5354.018 | 5235.96 | 12362.713 | 9006.814 |
| 263 | 8782.227 | 6617.934 | 6635.333 | 12471.727 | 14571.429 | 16427.68 | 14749.295 | 5418.592 | 6030.48 | 4810.522 | 5348.589 | 5230.676 | 12350.189 | 9003.628 |
| 264 | 8773.566 | 6615.527 | 6629.099 | 12466.899 | 14571.429 | 16427.68 | 14745.146 | 5416.684 | 6030.48 | 4806.002 | 5343.171 | 5226.281 | 12337.737 | 9000.456 |
| 265 | 8764.955 | 6613.131 | 6622.901 | 12466.899 | 14571.429 | 16418.367 | 14741.015 | 5415.731 | 6030.48 | 4801.563 | 5337.764 | 5221.017 | 12325.357 | 8997.298 |
| 266 | 8756.392 | 6610.746 | 6616.737 | 12462.074 | 14571.429 | 16418.367 | 14736.902 | 5413.826 | 6030.48 | 4797.059 | 5332.367 | 5216.639 | 12313.048 | 8994.155 |
| 267 | 8747.878 | 6608.372 | 6610.608 | 12462.074 | 14571.429 | 16418.367 | 14732.807 | 5411.922 | 6030.48 | 4792.636 | 5326.982 | 5211.394 | 12300.81 | 8991.025 |
| 268 | 8739.412 | 6606.008 | 6604.513 | 12457.253 | 14571.429 | 16409.065 | 14728.729 | 5410.97 | 6030.48 | 4788.222 | 5320.713 | 5206.16 | 12288.642 | 8987.909 |
| 269 | 8730.994 | 6603.654 | 6598.451 | 12457.253 | 14571.429 | 16409.065 | 14724.668 | 5409.069 | 6030.48 | 4783.816 | 5315.351 | 5201.806 | 12276.542 | 8984.807 |
| 270 | 8722.623 | 6601.311 | 6592.423 | 12452.436 | 14571.429 | 16399.773 | 14720.625 | 5407.168 | 6030.48 | 4779.417 | 5310 | 5197.46 | 12264.511 | 8981.719 |
| 271 | 8714.299 | 6598.978 | 6586.429 | 12452.436 | 14571.429 | 16399.773 | 14716.599 | 5406.218 | 6030.48 | 4775.099 | 5304.66 | 5192.254 | 12252.548 | 8978.644 |
| 272 | 8706.022 | 6596.656 | 6580.467 | 12452.436 | 14571.429 | 16390.492 | 14712.59 | 5404.32 | 6030.48 | 4770.789 | 5299.33 | 5187.923 | 12240.651 | 8975.582 |
| 273 | 8697.79 | 6594.343 | 6574.537 | 12447.623 | 14571.429 | 16390.492 | 14708.597 | 5403.371 | 6030.48 | 4766.486 | 5294.011 | 5182.736 | 12228.822 | 8972.534 |
| 274 | 8689.604 | 6592.041 | 6568.64 | 12447.623 | 14571.429 | 16381.222 | 14704.622 | 5401.474 | 6030.48 | 4762.191 | 5288.703 | 5178.422 | 12217.058 | 8969.499 |
| 275 | 8681.462 | 6589.748 | 6562.775 | 12442.813 | 14571.429 | 16381.222 | 14700.662 | 5399.579 | 6030.48 | 4757.975 | 5283.406 | 5173.253 | 12205.359 | 8966.477 |
| 276 | 8673.365 | 6587.465 | 6556.941 | 12442.813 | 14571.429 | 16371.962 | 14696.72 | 5398.632 | 6030.48 | 4753.695 | 5278.119 | 5168.955 | 12193.725 | 8963.468 |
| 277 | 8665.313 | 6585.192 | 6551.139 | 12438.007 | 14571.429 | 16371.962 | 14692.793 | 5396.739 | 6030.48 | 4749.494 | 5273.721 | 5164.663 | 12182.154 | 8960.471 |
| 278 | 8657.304 | 6582.929 | 6545.368 | 12438.007 | 14571.429 | 16362.712 | 14688.883 | 5395.792 | 6030.48 | 4745.301 | 5268.453 | 5160.378 | 12170.648 | 8957.488 |
| 279 | 8649.339 | 6580.676 | 6539.627 | 12433.205 | 14571.429 | 16362.712 | 14684.989 | 5393.901 | 6030.48 | 4741.186 | 5263.196 | 5155.246 | 12159.204 | 8954.517 |
| 280 | 8641.416 | 6578.432 | 6533.917 | 12433.205 | 14571.429 | 16353.473 | 14681.111 | 5392.956 | 6030.48 | 4737.007 | 5257.95 | 5150.977 | 12147.822 | 8951.558 |
| 281 | 8633.536 | 6576.197 | 6528.237 | 12433.205 | 14571.429 | 16353.473 | 14677.249 | 5391.067 | 6030.48 | 4732.906 | 5252.714 | 5146.715 | 12136.501 | 8948.613 |
| 282 | 8625.699 | 6573.972 | 6522.587 | 12428.406 | 14571.429 | 16344.244 | 14673.402 | 5390.123 | 6030.48 | 4728.813 | 5247.488 | 5141.61 | 12125.242 | 8945.679 |
| 283 | 8617.903 | 6571.757 | 6516.967 | 12428.406 | 14571.429 | 16344.244 | 14669.571 | 5388.235 | 6030.48 | 4724.726 | 5243.141 | 5137.364 | 12114.043 | 8942.758 |
| 284 | 8610.148 | 6569.55 | 6511.376 | 12423.611 | 14571.429 | 16335.025 | 14665.755 | 5387.292 | 6030.48 | 4720.647 | 5237.934 | 5133.124 | 12102.904 | 8939.849 |
| 285 | 8602.435 | 6567.353 | 6505.814 | 12423.611 | 14571.429 | 16335.025 | 14661.955 | 5385.407 | 6030.48 | 4716.644 | 5232.738 | 5128.892 | 12091.825 | 8936.952 |
| 286 | 8594.762 | 6565.165 | 6500.281 | 12418.82 | 14571.429 | 16325.817 | 14658.17 | 5384.465 | 6030.48 | 4712.649 | 5227.552 | 5124.666 | 12080.804 | 8934.067 |
| 287 | 8587.129 | 6562.986 | 6494.777 | 12418.82 | 14571.429 | 16325.817 | 14654.4 | 5382.581 | 6030.48 | 4708.66 | 5223.238 | 5120.448 | 12069.842 | 8931.193 |
| 288 | 8579.537 | 6560.816 | 6489.301 | 12414.032 | 14571.429 | 16316.62 | 14650.645 | 5381.64 | 6030.48 | 4704.678 | 5218.071 | 5115.395 | 12058.937 | 8928.332 |
| 289 | 8571.984 | 6558.655 | 6483.853 | 12414.032 | 14571.429 | 16316.62 | 14646.905 | 5380.699 | 6030.48 | 4700.703 | 5212.914 | 5111.191 | 12048.09 | 8925.482 |
| 290 | 8564.47 | 6556.503 | 6478.433 | 12414.032 | 14571.429 | 16307.432 | 14643.179 | 5378.819 | 6030.48 | 4696.804 | 5208.624 | 5106.995 | 12037.299 | 8922.644 |
| 291 | 8556.995 | 6554.359 | 6473.04 | 12409.249 | 14571.429 | 16307.432 | 14639.469 | 5377.879 | 6030.48 | 4692.911 | 5203.486 | 5102.806 | 12026.565 | 8919.818 |
| 292 | 8549.559 | 6552.225 | 6467.675 | 12409.249 | 14571.429 | 16298.255 | 14635.773 | 5376 | 6030.48 | 4689.025 | 5198.357 | 5098.623 | 12015.886 | 8917.003 |
| 293 | 8542.16 | 6550.098 | 6462.337 | 12404.468 | 14571.429 | 16298.255 | 14632.091 | 5375.061 | 6030.48 | 4685.145 | 5194.092 | 5094.447 | 12005.263 | 8914.199 |
| 294 | 8534.8 | 6547.981 | 6457.026 | 12404.468 | 14571.429 | 16289.089 | 14628.424 | 5374.123 | 6030.48 | 4681.272 | 5188.982 | 5090.278 | 11994.694 | 8911.406 |
| 295 | 8527.477 | 6545.872 | 6451.742 | 12399.692 | 14571.429 | 16289.089 | 14624.771 | 5372.246 | 6030.48 | 4677.474 | 5184.731 | 5086.116 | 11984.18 | 8908.625 |
| 296 | 8520.192 | 6543.772 | 6446.484 | 12399.692 | 14571.429 | 16279.933 | 14621.132 | 5371.309 | 6030.48 | 4673.613 | 5179.64 | 5081.961 | 11973.719 | 8905.855 |
| 297 | 8512.943 | 6541.679 | 6441.252 | 12399.692 | 14571.429 | 16279.933 | 14617.507 | 5369.435 | 6030.48 | 4669.828 | 5175.405 | 5077.812 | 11963.312 | 8903.096 |
| 298 | 8505.73 | 6539.596 | 6436.046 | 12394.919 | 14571.429 | 16270.787 | 14613.896 | 5368.498 | 6030.48 | 4666.049 | 5170.332 | 5073.67 | 11952.957 | 8900.348 |
| 299 | 8498.554 | 6537.52 | 6430.866 | 12394.919 | 14571.429 | 16270.787 | 14610.299 | 5367.562 | 6030.48 | 4662.275 | 5166.112 | 5069.535 | 11942.655 | 8897.61 |